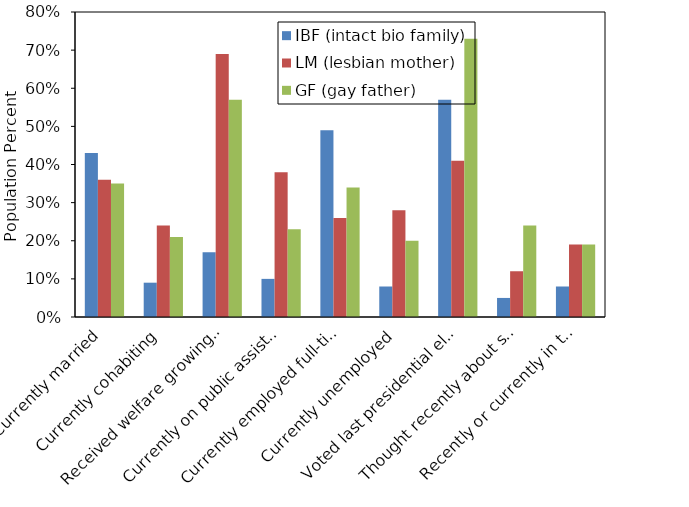
| Category | IBF (intact bio family) | LM (lesbian mother) | GF (gay father) |
|---|---|---|---|
| Currently married | 0.43 | 0.36 | 0.35 |
| Currently cohabiting | 0.09 | 0.24 | 0.21 |
| Received welfare growing up | 0.17 | 0.69 | 0.57 |
| Currently on public assistance | 0.1 | 0.38 | 0.23 |
| Currently employed full-time | 0.49 | 0.26 | 0.34 |
| Currently unemployed | 0.08 | 0.28 | 0.2 |
| Voted last presidential election | 0.57 | 0.41 | 0.73 |
| Thought recently about suicide | 0.05 | 0.12 | 0.24 |
| Recently or currently in therapy | 0.08 | 0.19 | 0.19 |